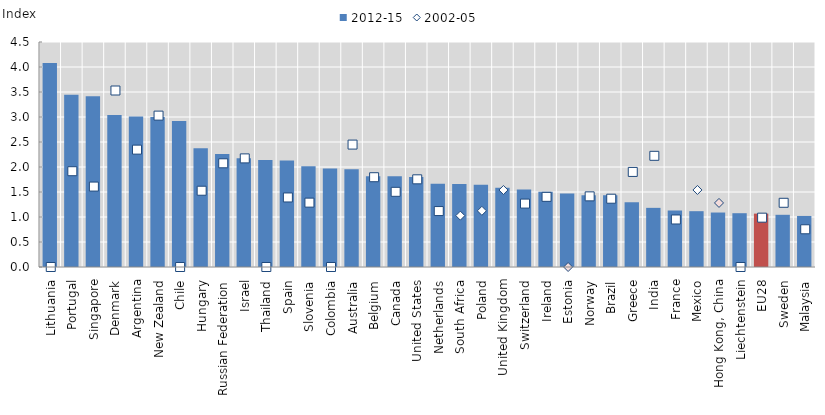
| Category | 2012-15 |
|---|---|
| Lithuania | 4.082 |
| Portugal | 3.445 |
| Singapore | 3.414 |
| Denmark | 3.038 |
| Argentina | 3.011 |
| New Zealand | 2.998 |
| Chile | 2.919 |
| Hungary | 2.376 |
| Russian Federation | 2.259 |
| Israel | 2.176 |
| Thailand | 2.14 |
| Spain | 2.128 |
| Slovenia | 2.016 |
| Colombia | 1.968 |
| Australia | 1.956 |
| Belgium | 1.815 |
| Canada | 1.813 |
| United States | 1.798 |
| Netherlands | 1.666 |
| South Africa | 1.661 |
| Poland | 1.643 |
| United Kingdom | 1.584 |
| Switzerland | 1.549 |
| Ireland | 1.504 |
| Estonia | 1.472 |
| Norway | 1.437 |
| Brazil | 1.434 |
| Greece | 1.295 |
| India | 1.183 |
| France | 1.13 |
| Mexico | 1.116 |
| Hong Kong, China | 1.089 |
| Liechtenstein | 1.076 |
| EU28 | 1.068 |
| Sweden | 1.044 |
| Malaysia | 1.021 |